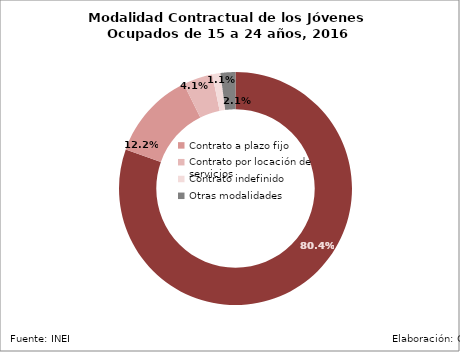
| Category | Series 0 | Series 1 |
|---|---|---|
| Sin contrato |  | 0.804 |
| Contrato a plazo fijo |  | 0.122 |
| Contrato por locación de servicios  |  | 0.041 |
| Contrato indefinido |  | 0.011 |
| Otras modalidades |  | 0.021 |